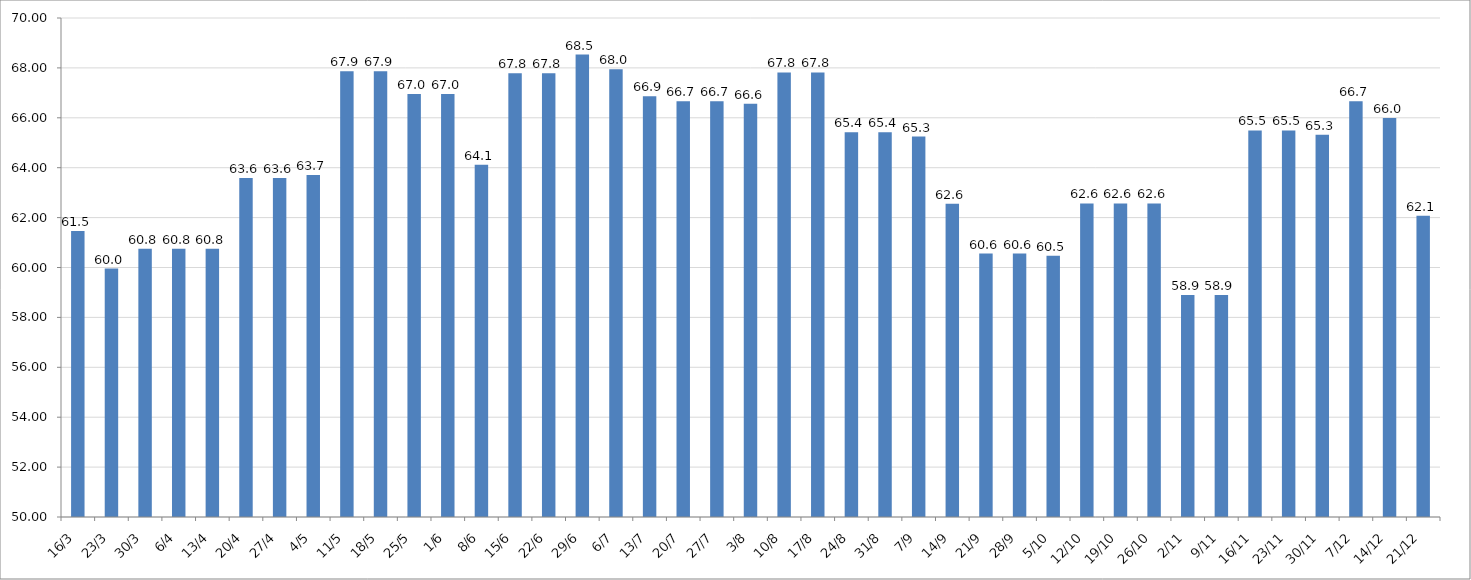
| Category | Series 0 |
|---|---|
| 2020-03-16 | 61.467 |
| 2020-03-23 | 59.958 |
| 2020-03-30 | 60.75 |
| 2020-04-06 | 60.75 |
| 2020-04-13 | 60.75 |
| 2020-04-20 | 63.583 |
| 2020-04-27 | 63.583 |
| 2020-05-04 | 63.708 |
| 2020-05-11 | 67.867 |
| 2020-05-18 | 67.867 |
| 2020-05-25 | 66.95 |
| 2020-06-01 | 66.95 |
| 2020-06-08 | 64.117 |
| 2020-06-15 | 67.783 |
| 2020-06-22 | 67.783 |
| 2020-06-29 | 68.533 |
| 2020-07-06 | 67.95 |
| 2020-07-13 | 66.867 |
| 2020-07-20 | 66.667 |
| 2020-07-27 | 66.667 |
| 2020-08-03 | 66.567 |
| 2020-08-10 | 67.817 |
| 2020-08-17 | 67.817 |
| 2020-08-24 | 65.417 |
| 2020-08-31 | 65.417 |
| 2020-09-07 | 65.25 |
| 2020-09-14 | 62.558 |
| 2020-09-21 | 60.558 |
| 2020-09-28 | 60.558 |
| 2020-10-05 | 60.475 |
| 2020-10-12 | 62.567 |
| 2020-10-19 | 62.567 |
| 2020-10-26 | 62.567 |
| 2020-11-02 | 58.9 |
| 2020-11-09 | 58.9 |
| 2020-11-16 | 65.492 |
| 2020-11-23 | 65.492 |
| 2020-11-30 | 65.325 |
| 2020-12-07 | 66.658 |
| 2020-12-14 | 65.992 |
| 2020-12-21 | 62.075 |